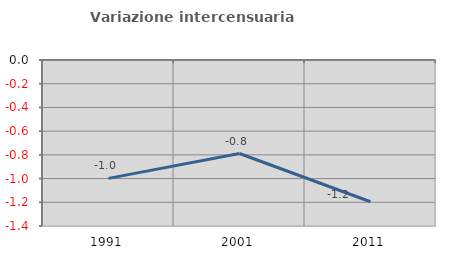
| Category | Variazione intercensuaria annua |
|---|---|
| 1991.0 | -0.998 |
| 2001.0 | -0.789 |
| 2011.0 | -1.195 |